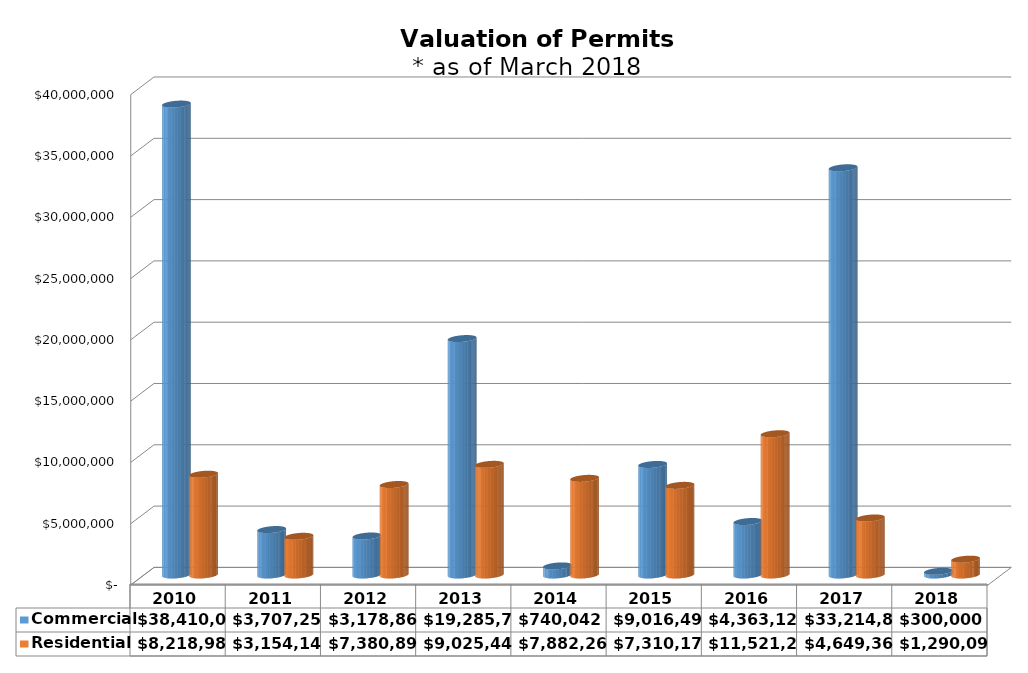
| Category | Commercial | Residential |
|---|---|---|
| 2010.0 | 38410000 | 8218988 |
| 2011.0 | 3707250 | 3154142 |
| 2012.0 | 3178860 | 7380891 |
| 2013.0 | 19285700 | 9025445.89 |
| 2014.0 | 740042 | 7882269 |
| 2015.0 | 9016490 | 7310174 |
| 2016.0 | 4363129 | 11521278 |
| 2017.0 | 33214828 | 4649365 |
| 2018.0 | 300000 | 1290091 |